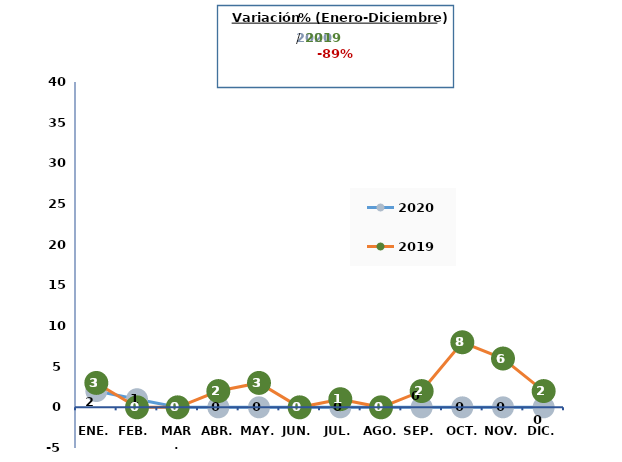
| Category | 2020 | 2019 |
|---|---|---|
| Ene. | 2 | 3 |
| Feb. | 1 | 0 |
| Mar. | 0 | 0 |
| Abr. | 0 | 2 |
| May. | 0 | 3 |
| Jun. | 0 | 0 |
| Jul. | 0 | 1 |
| Ago. | 0 | 0 |
| Sep. | 0 | 2 |
| Oct. | 0 | 8 |
| Nov. | 0 | 6 |
| Dic. | 0 | 2 |